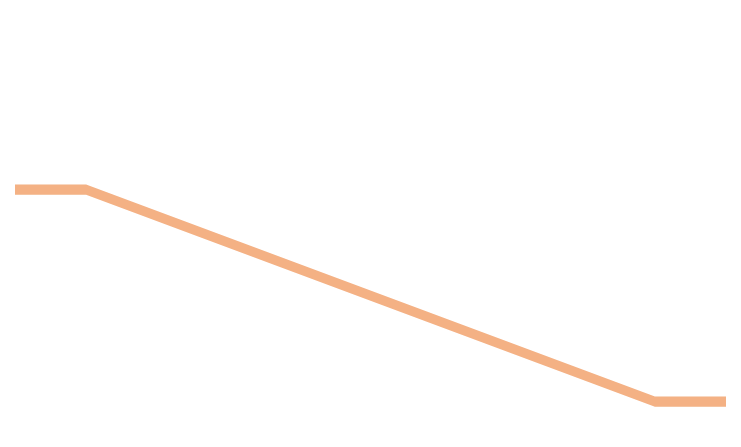
| Category | Series 0 | Series 1 | Series 2 |
|---|---|---|---|
| 0.0 | 1631.799 | 98.838 | 2282.523 |
| 10.0 | 1631.799 | 98.838 | 2282.523 |
| 90.0 | 3671.189 | 98.838 | 243.134 |
| 100.0 | 3671.189 | 98.838 | 243.134 |